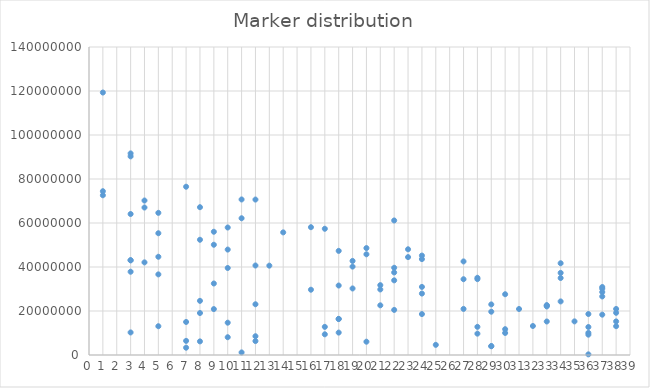
| Category | Series 0 |
|---|---|
| 1.0 | 72613047 |
| 1.0 | 74450772 |
| 1.0 | 119306331 |
| 3.0 | 10255068 |
| 3.0 | 37849557 |
| 3.0 | 43055696 |
| 3.0 | 43063677 |
| 3.0 | 64084413 |
| 3.0 | 90291255 |
| 3.0 | 91626907 |
| 4.0 | 42104780 |
| 4.0 | 67040898 |
| 4.0 | 70217695 |
| 5.0 | 13080303 |
| 5.0 | 36642434 |
| 5.0 | 44650576 |
| 5.0 | 55349573 |
| 5.0 | 64611038 |
| 7.0 | 3318809 |
| 7.0 | 6423299 |
| 7.0 | 15017979 |
| 7.0 | 76487265 |
| 8.0 | 6188937 |
| 8.0 | 19076567 |
| 8.0 | 24614720 |
| 8.0 | 52381322 |
| 8.0 | 67183794 |
| 9.0 | 20867959 |
| 9.0 | 32506288 |
| 9.0 | 50114927 |
| 9.0 | 56021221 |
| 10.0 | 8085469 |
| 10.0 | 14685262 |
| 10.0 | 39548483 |
| 10.0 | 47923623 |
| 10.0 | 57954366 |
| 11.0 | 1161870 |
| 11.0 | 62157625 |
| 11.0 | 70698603 |
| 12.0 | 6337286 |
| 12.0 | 8532712 |
| 12.0 | 23059939 |
| 12.0 | 40681020 |
| 12.0 | 70657733 |
| 13.0 | 40616856 |
| 14.0 | 55735620 |
| 16.0 | 29675662 |
| 16.0 | 58093031 |
| 17.0 | 9407683 |
| 17.0 | 12787849 |
| 17.0 | 57371669 |
| 18.0 | 10189759 |
| 18.0 | 16385020 |
| 18.0 | 16388978 |
| 18.0 | 31579269 |
| 18.0 | 47325586 |
| 19.0 | 30246414 |
| 19.0 | 40189405 |
| 19.0 | 42756283 |
| 20.0 | 6046176 |
| 20.0 | 45777531 |
| 20.0 | 48602465 |
| 21.0 | 22581321 |
| 21.0 | 29796784 |
| 21.0 | 31751817 |
| 22.0 | 20498421 |
| 22.0 | 33934047 |
| 22.0 | 37522364 |
| 22.0 | 39647748 |
| 22.0 | 61153661 |
| 23.0 | 44497217 |
| 23.0 | 48055836 |
| 24.0 | 18599997 |
| 24.0 | 27925354 |
| 24.0 | 30954773 |
| 24.0 | 43589304 |
| 24.0 | 45191477 |
| 25.0 | 4614777 |
| 27.0 | 20948372 |
| 27.0 | 34444177 |
| 27.0 | 42526114 |
| 28.0 | 9703418 |
| 28.0 | 12804225 |
| 28.0 | 34478533 |
| 28.0 | 35104850 |
| 29.0 | 4020192 |
| 29.0 | 4022252 |
| 29.0 | 19681270 |
| 29.0 | 22992304 |
| 30.0 | 10012939 |
| 30.0 | 11735245 |
| 30.0 | 27619023 |
| 31.0 | 20912553 |
| 32.0 | 13183511 |
| 33.0 | 15233992 |
| 33.0 | 22070526 |
| 33.0 | 22472901 |
| 33.0 | 22648231 |
| 34.0 | 24351570 |
| 34.0 | 34993916 |
| 34.0 | 37323213 |
| 34.0 | 41703614 |
| 35.0 | 15283717 |
| 36.0 | 288045 |
| 36.0 | 9241262 |
| 36.0 | 10084888 |
| 36.0 | 12723744 |
| 36.0 | 18627936 |
| 37.0 | 18338930 |
| 37.0 | 26611359 |
| 37.0 | 28611801 |
| 37.0 | 30110473 |
| 37.0 | 30902202 |
| 38.0 | 13098194 |
| 38.0 | 15271384 |
| 38.0 | 19172567 |
| 38.0 | 20930997 |